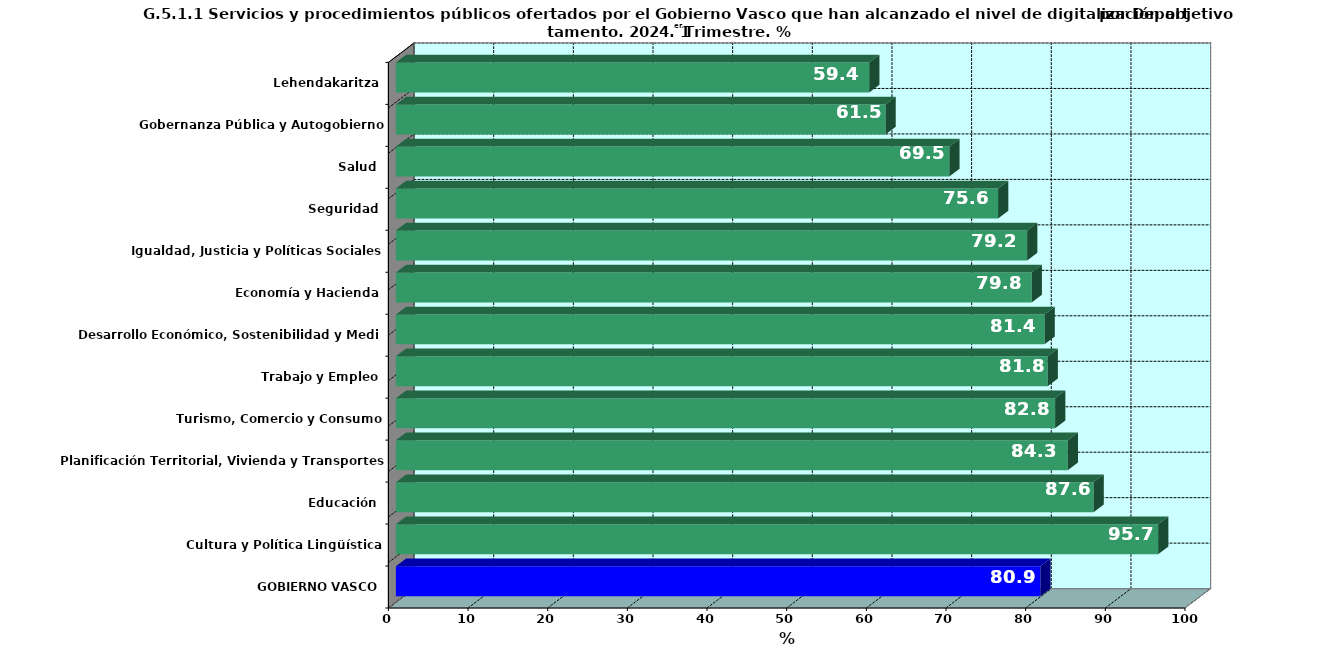
| Category | Series 0 |
|---|---|
| GOBIERNO VASCO | 80.905 |
| Cultura y Política Lingüística | 95.692 |
| Educación | 87.584 |
| Planificación Territorial, Vivienda y Transportes | 84.343 |
| Turismo, Comercio y Consumo | 82.759 |
| Trabajo y Empleo | 81.818 |
| Desarrollo Económico, Sostenibilidad y Medio Ambiente | 81.433 |
| Economía y Hacienda | 79.817 |
| Igualdad, Justicia y Políticas Sociales | 79.245 |
| Seguridad | 75.6 |
| Salud | 69.478 |
| Gobernanza Pública y Autogobierno | 61.463 |
| Lehendakaritza | 59.42 |